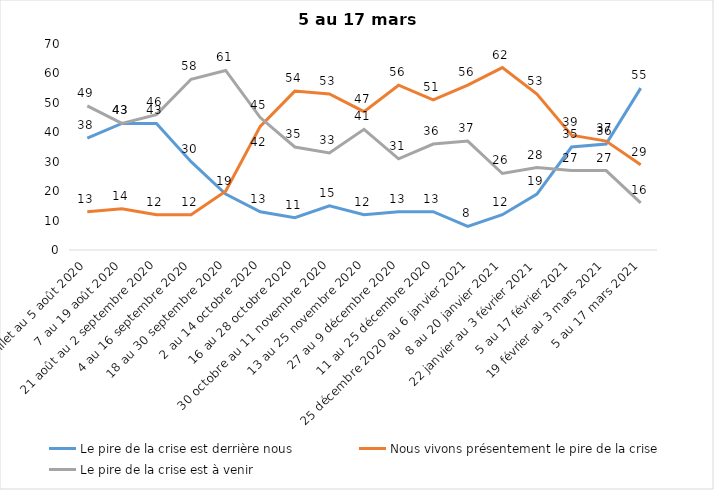
| Category | Le pire de la crise est derrière nous | Nous vivons présentement le pire de la crise | Le pire de la crise est à venir |
|---|---|---|---|
| 24 juillet au 5 août 2020 | 38 | 13 | 49 |
| 7 au 19 août 2020 | 43 | 14 | 43 |
| 21 août au 2 septembre 2020 | 43 | 12 | 46 |
| 4 au 16 septembre 2020 | 30 | 12 | 58 |
| 18 au 30 septembre 2020 | 19 | 20 | 61 |
| 2 au 14 octobre 2020 | 13 | 42 | 45 |
| 16 au 28 octobre 2020 | 11 | 54 | 35 |
| 30 octobre au 11 novembre 2020 | 15 | 53 | 33 |
| 13 au 25 novembre 2020 | 12 | 47 | 41 |
| 27 au 9 décembre 2020 | 13 | 56 | 31 |
| 11 au 25 décembre 2020 | 13 | 51 | 36 |
| 25 décembre 2020 au 6 janvier 2021 | 8 | 56 | 37 |
| 8 au 20 janvier 2021 | 12 | 62 | 26 |
| 22 janvier au 3 février 2021 | 19 | 53 | 28 |
| 5 au 17 février 2021 | 35 | 39 | 27 |
| 19 février au 3 mars 2021 | 36 | 37 | 27 |
| 5 au 17 mars 2021 | 55 | 29 | 16 |